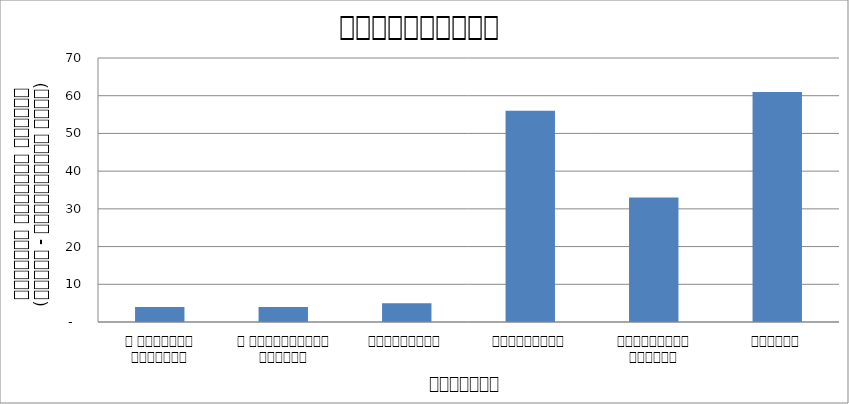
| Category | भ्रष्टाचार |
|---|---|
| द हिमालयन टाइम्स् | 4 |
| द काठमाण्डौं पोस्ट् | 4 |
| रिपब्लिका | 5 |
| कान्तिपुर | 56 |
| अन्नपूर्ण पोस्ट् | 33 |
| नागरिक | 61 |